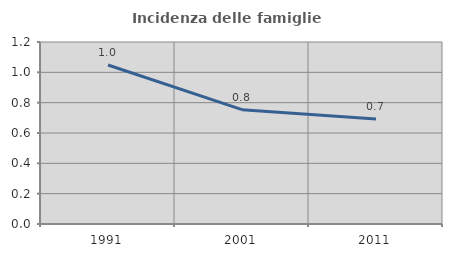
| Category | Incidenza delle famiglie numerose |
|---|---|
| 1991.0 | 1.048 |
| 2001.0 | 0.754 |
| 2011.0 | 0.692 |